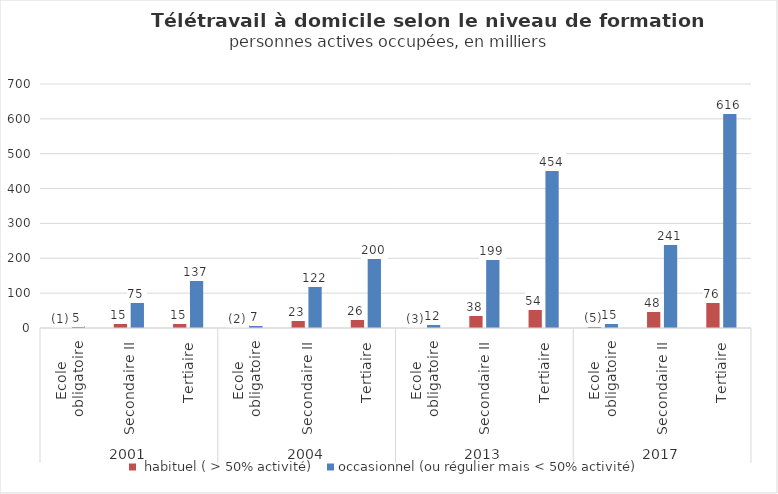
| Category |  habituel ( > 50% activité) | occasionnel (ou régulier mais < 50% activité) |
|---|---|---|
| 0 | 1.457 | 5.098 |
| 1 | 14.624 | 74.986 |
| 2 | 15.265 | 136.869 |
| 3 | 1.999 | 7.328 |
| 4 | 23.271 | 121.797 |
| 5 | 26.395 | 199.903 |
| 6 | 2.686 | 11.617 |
| 7 | 37.804 | 198.747 |
| 8 | 53.913 | 453.729 |
| 9 | 4.519 | 15.045 |
| 10 | 47.798 | 240.675 |
| 11 | 75.663 | 615.808 |